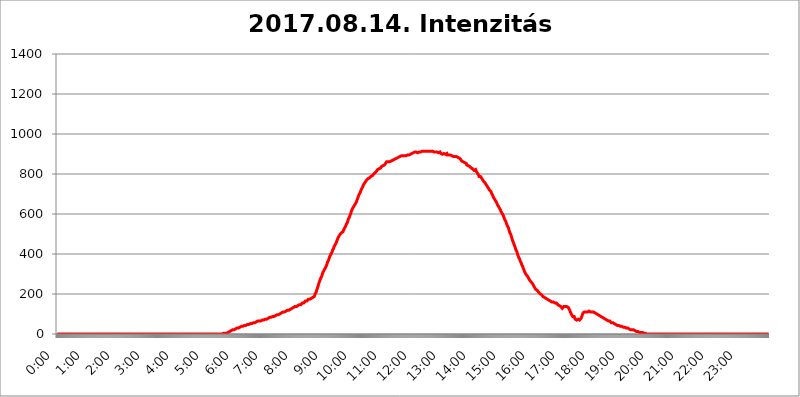
| Category | 2017.08.14. Intenzitás [W/m^2] |
|---|---|
| 0.0 | 0 |
| 0.0006944444444444445 | 0 |
| 0.001388888888888889 | 0 |
| 0.0020833333333333333 | 0 |
| 0.002777777777777778 | 0 |
| 0.003472222222222222 | 0 |
| 0.004166666666666667 | 0 |
| 0.004861111111111111 | 0 |
| 0.005555555555555556 | 0 |
| 0.0062499999999999995 | 0 |
| 0.006944444444444444 | 0 |
| 0.007638888888888889 | 0 |
| 0.008333333333333333 | 0 |
| 0.009027777777777779 | 0 |
| 0.009722222222222222 | 0 |
| 0.010416666666666666 | 0 |
| 0.011111111111111112 | 0 |
| 0.011805555555555555 | 0 |
| 0.012499999999999999 | 0 |
| 0.013194444444444444 | 0 |
| 0.013888888888888888 | 0 |
| 0.014583333333333332 | 0 |
| 0.015277777777777777 | 0 |
| 0.015972222222222224 | 0 |
| 0.016666666666666666 | 0 |
| 0.017361111111111112 | 0 |
| 0.018055555555555557 | 0 |
| 0.01875 | 0 |
| 0.019444444444444445 | 0 |
| 0.02013888888888889 | 0 |
| 0.020833333333333332 | 0 |
| 0.02152777777777778 | 0 |
| 0.022222222222222223 | 0 |
| 0.02291666666666667 | 0 |
| 0.02361111111111111 | 0 |
| 0.024305555555555556 | 0 |
| 0.024999999999999998 | 0 |
| 0.025694444444444447 | 0 |
| 0.02638888888888889 | 0 |
| 0.027083333333333334 | 0 |
| 0.027777777777777776 | 0 |
| 0.02847222222222222 | 0 |
| 0.029166666666666664 | 0 |
| 0.029861111111111113 | 0 |
| 0.030555555555555555 | 0 |
| 0.03125 | 0 |
| 0.03194444444444445 | 0 |
| 0.03263888888888889 | 0 |
| 0.03333333333333333 | 0 |
| 0.034027777777777775 | 0 |
| 0.034722222222222224 | 0 |
| 0.035416666666666666 | 0 |
| 0.036111111111111115 | 0 |
| 0.03680555555555556 | 0 |
| 0.0375 | 0 |
| 0.03819444444444444 | 0 |
| 0.03888888888888889 | 0 |
| 0.03958333333333333 | 0 |
| 0.04027777777777778 | 0 |
| 0.04097222222222222 | 0 |
| 0.041666666666666664 | 0 |
| 0.042361111111111106 | 0 |
| 0.04305555555555556 | 0 |
| 0.043750000000000004 | 0 |
| 0.044444444444444446 | 0 |
| 0.04513888888888889 | 0 |
| 0.04583333333333334 | 0 |
| 0.04652777777777778 | 0 |
| 0.04722222222222222 | 0 |
| 0.04791666666666666 | 0 |
| 0.04861111111111111 | 0 |
| 0.049305555555555554 | 0 |
| 0.049999999999999996 | 0 |
| 0.05069444444444445 | 0 |
| 0.051388888888888894 | 0 |
| 0.052083333333333336 | 0 |
| 0.05277777777777778 | 0 |
| 0.05347222222222222 | 0 |
| 0.05416666666666667 | 0 |
| 0.05486111111111111 | 0 |
| 0.05555555555555555 | 0 |
| 0.05625 | 0 |
| 0.05694444444444444 | 0 |
| 0.057638888888888885 | 0 |
| 0.05833333333333333 | 0 |
| 0.05902777777777778 | 0 |
| 0.059722222222222225 | 0 |
| 0.06041666666666667 | 0 |
| 0.061111111111111116 | 0 |
| 0.06180555555555556 | 0 |
| 0.0625 | 0 |
| 0.06319444444444444 | 0 |
| 0.06388888888888888 | 0 |
| 0.06458333333333334 | 0 |
| 0.06527777777777778 | 0 |
| 0.06597222222222222 | 0 |
| 0.06666666666666667 | 0 |
| 0.06736111111111111 | 0 |
| 0.06805555555555555 | 0 |
| 0.06874999999999999 | 0 |
| 0.06944444444444443 | 0 |
| 0.07013888888888889 | 0 |
| 0.07083333333333333 | 0 |
| 0.07152777777777779 | 0 |
| 0.07222222222222223 | 0 |
| 0.07291666666666667 | 0 |
| 0.07361111111111111 | 0 |
| 0.07430555555555556 | 0 |
| 0.075 | 0 |
| 0.07569444444444444 | 0 |
| 0.0763888888888889 | 0 |
| 0.07708333333333334 | 0 |
| 0.07777777777777778 | 0 |
| 0.07847222222222222 | 0 |
| 0.07916666666666666 | 0 |
| 0.0798611111111111 | 0 |
| 0.08055555555555556 | 0 |
| 0.08125 | 0 |
| 0.08194444444444444 | 0 |
| 0.08263888888888889 | 0 |
| 0.08333333333333333 | 0 |
| 0.08402777777777777 | 0 |
| 0.08472222222222221 | 0 |
| 0.08541666666666665 | 0 |
| 0.08611111111111112 | 0 |
| 0.08680555555555557 | 0 |
| 0.08750000000000001 | 0 |
| 0.08819444444444445 | 0 |
| 0.08888888888888889 | 0 |
| 0.08958333333333333 | 0 |
| 0.09027777777777778 | 0 |
| 0.09097222222222222 | 0 |
| 0.09166666666666667 | 0 |
| 0.09236111111111112 | 0 |
| 0.09305555555555556 | 0 |
| 0.09375 | 0 |
| 0.09444444444444444 | 0 |
| 0.09513888888888888 | 0 |
| 0.09583333333333333 | 0 |
| 0.09652777777777777 | 0 |
| 0.09722222222222222 | 0 |
| 0.09791666666666667 | 0 |
| 0.09861111111111111 | 0 |
| 0.09930555555555555 | 0 |
| 0.09999999999999999 | 0 |
| 0.10069444444444443 | 0 |
| 0.1013888888888889 | 0 |
| 0.10208333333333335 | 0 |
| 0.10277777777777779 | 0 |
| 0.10347222222222223 | 0 |
| 0.10416666666666667 | 0 |
| 0.10486111111111111 | 0 |
| 0.10555555555555556 | 0 |
| 0.10625 | 0 |
| 0.10694444444444444 | 0 |
| 0.1076388888888889 | 0 |
| 0.10833333333333334 | 0 |
| 0.10902777777777778 | 0 |
| 0.10972222222222222 | 0 |
| 0.1111111111111111 | 0 |
| 0.11180555555555556 | 0 |
| 0.11180555555555556 | 0 |
| 0.1125 | 0 |
| 0.11319444444444444 | 0 |
| 0.11388888888888889 | 0 |
| 0.11458333333333333 | 0 |
| 0.11527777777777777 | 0 |
| 0.11597222222222221 | 0 |
| 0.11666666666666665 | 0 |
| 0.1173611111111111 | 0 |
| 0.11805555555555557 | 0 |
| 0.11944444444444445 | 0 |
| 0.12013888888888889 | 0 |
| 0.12083333333333333 | 0 |
| 0.12152777777777778 | 0 |
| 0.12222222222222223 | 0 |
| 0.12291666666666667 | 0 |
| 0.12291666666666667 | 0 |
| 0.12361111111111112 | 0 |
| 0.12430555555555556 | 0 |
| 0.125 | 0 |
| 0.12569444444444444 | 0 |
| 0.12638888888888888 | 0 |
| 0.12708333333333333 | 0 |
| 0.16875 | 0 |
| 0.12847222222222224 | 0 |
| 0.12916666666666668 | 0 |
| 0.12986111111111112 | 0 |
| 0.13055555555555556 | 0 |
| 0.13125 | 0 |
| 0.13194444444444445 | 0 |
| 0.1326388888888889 | 0 |
| 0.13333333333333333 | 0 |
| 0.13402777777777777 | 0 |
| 0.13402777777777777 | 0 |
| 0.13472222222222222 | 0 |
| 0.13541666666666666 | 0 |
| 0.1361111111111111 | 0 |
| 0.13749999999999998 | 0 |
| 0.13819444444444443 | 0 |
| 0.1388888888888889 | 0 |
| 0.13958333333333334 | 0 |
| 0.14027777777777778 | 0 |
| 0.14097222222222222 | 0 |
| 0.14166666666666666 | 0 |
| 0.1423611111111111 | 0 |
| 0.14305555555555557 | 0 |
| 0.14375000000000002 | 0 |
| 0.14444444444444446 | 0 |
| 0.1451388888888889 | 0 |
| 0.1451388888888889 | 0 |
| 0.14652777777777778 | 0 |
| 0.14722222222222223 | 0 |
| 0.14791666666666667 | 0 |
| 0.1486111111111111 | 0 |
| 0.14930555555555555 | 0 |
| 0.15 | 0 |
| 0.15069444444444444 | 0 |
| 0.15138888888888888 | 0 |
| 0.15208333333333332 | 0 |
| 0.15277777777777776 | 0 |
| 0.15347222222222223 | 0 |
| 0.15416666666666667 | 0 |
| 0.15486111111111112 | 0 |
| 0.15555555555555556 | 0 |
| 0.15625 | 0 |
| 0.15694444444444444 | 0 |
| 0.15763888888888888 | 0 |
| 0.15833333333333333 | 0 |
| 0.15902777777777777 | 0 |
| 0.15972222222222224 | 0 |
| 0.16041666666666668 | 0 |
| 0.16111111111111112 | 0 |
| 0.16180555555555556 | 0 |
| 0.1625 | 0 |
| 0.16319444444444445 | 0 |
| 0.1638888888888889 | 0 |
| 0.16458333333333333 | 0 |
| 0.16527777777777777 | 0 |
| 0.16597222222222222 | 0 |
| 0.16666666666666666 | 0 |
| 0.1673611111111111 | 0 |
| 0.16805555555555554 | 0 |
| 0.16874999999999998 | 0 |
| 0.16944444444444443 | 0 |
| 0.17013888888888887 | 0 |
| 0.1708333333333333 | 0 |
| 0.17152777777777775 | 0 |
| 0.17222222222222225 | 0 |
| 0.1729166666666667 | 0 |
| 0.17361111111111113 | 0 |
| 0.17430555555555557 | 0 |
| 0.17500000000000002 | 0 |
| 0.17569444444444446 | 0 |
| 0.1763888888888889 | 0 |
| 0.17708333333333334 | 0 |
| 0.17777777777777778 | 0 |
| 0.17847222222222223 | 0 |
| 0.17916666666666667 | 0 |
| 0.1798611111111111 | 0 |
| 0.18055555555555555 | 0 |
| 0.18125 | 0 |
| 0.18194444444444444 | 0 |
| 0.1826388888888889 | 0 |
| 0.18333333333333335 | 0 |
| 0.1840277777777778 | 0 |
| 0.18472222222222223 | 0 |
| 0.18541666666666667 | 0 |
| 0.18611111111111112 | 0 |
| 0.18680555555555556 | 0 |
| 0.1875 | 0 |
| 0.18819444444444444 | 0 |
| 0.18888888888888888 | 0 |
| 0.18958333333333333 | 0 |
| 0.19027777777777777 | 0 |
| 0.1909722222222222 | 0 |
| 0.19166666666666665 | 0 |
| 0.19236111111111112 | 0 |
| 0.19305555555555554 | 0 |
| 0.19375 | 0 |
| 0.19444444444444445 | 0 |
| 0.1951388888888889 | 0 |
| 0.19583333333333333 | 0 |
| 0.19652777777777777 | 0 |
| 0.19722222222222222 | 0 |
| 0.19791666666666666 | 0 |
| 0.1986111111111111 | 0 |
| 0.19930555555555554 | 0 |
| 0.19999999999999998 | 0 |
| 0.20069444444444443 | 0 |
| 0.20138888888888887 | 0 |
| 0.2020833333333333 | 0 |
| 0.2027777777777778 | 0 |
| 0.2034722222222222 | 0 |
| 0.2041666666666667 | 0 |
| 0.20486111111111113 | 0 |
| 0.20555555555555557 | 0 |
| 0.20625000000000002 | 0 |
| 0.20694444444444446 | 0 |
| 0.2076388888888889 | 0 |
| 0.20833333333333334 | 0 |
| 0.20902777777777778 | 0 |
| 0.20972222222222223 | 0 |
| 0.21041666666666667 | 0 |
| 0.2111111111111111 | 0 |
| 0.21180555555555555 | 0 |
| 0.2125 | 0 |
| 0.21319444444444444 | 0 |
| 0.2138888888888889 | 0 |
| 0.21458333333333335 | 0 |
| 0.2152777777777778 | 0 |
| 0.21597222222222223 | 0 |
| 0.21666666666666667 | 0 |
| 0.21736111111111112 | 0 |
| 0.21805555555555556 | 0 |
| 0.21875 | 0 |
| 0.21944444444444444 | 0 |
| 0.22013888888888888 | 0 |
| 0.22083333333333333 | 0 |
| 0.22152777777777777 | 0 |
| 0.2222222222222222 | 0 |
| 0.22291666666666665 | 0 |
| 0.2236111111111111 | 0 |
| 0.22430555555555556 | 0 |
| 0.225 | 0 |
| 0.22569444444444445 | 0 |
| 0.2263888888888889 | 0 |
| 0.22708333333333333 | 0 |
| 0.22777777777777777 | 0 |
| 0.22847222222222222 | 0 |
| 0.22916666666666666 | 0 |
| 0.2298611111111111 | 0 |
| 0.23055555555555554 | 0 |
| 0.23124999999999998 | 0 |
| 0.23194444444444443 | 3.525 |
| 0.23263888888888887 | 3.525 |
| 0.2333333333333333 | 3.525 |
| 0.2340277777777778 | 3.525 |
| 0.2347222222222222 | 3.525 |
| 0.2354166666666667 | 3.525 |
| 0.23611111111111113 | 3.525 |
| 0.23680555555555557 | 3.525 |
| 0.23750000000000002 | 3.525 |
| 0.23819444444444446 | 3.525 |
| 0.2388888888888889 | 7.887 |
| 0.23958333333333334 | 7.887 |
| 0.24027777777777778 | 7.887 |
| 0.24097222222222223 | 12.257 |
| 0.24166666666666667 | 12.257 |
| 0.2423611111111111 | 12.257 |
| 0.24305555555555555 | 12.257 |
| 0.24375 | 16.636 |
| 0.24444444444444446 | 16.636 |
| 0.24513888888888888 | 16.636 |
| 0.24583333333333335 | 21.024 |
| 0.2465277777777778 | 21.024 |
| 0.24722222222222223 | 21.024 |
| 0.24791666666666667 | 21.024 |
| 0.24861111111111112 | 21.024 |
| 0.24930555555555556 | 25.419 |
| 0.25 | 25.419 |
| 0.25069444444444444 | 25.419 |
| 0.2513888888888889 | 25.419 |
| 0.2520833333333333 | 29.823 |
| 0.25277777777777777 | 29.823 |
| 0.2534722222222222 | 29.823 |
| 0.25416666666666665 | 29.823 |
| 0.2548611111111111 | 29.823 |
| 0.2555555555555556 | 34.234 |
| 0.25625000000000003 | 34.234 |
| 0.2569444444444445 | 34.234 |
| 0.2576388888888889 | 34.234 |
| 0.25833333333333336 | 38.653 |
| 0.2590277777777778 | 38.653 |
| 0.25972222222222224 | 38.653 |
| 0.2604166666666667 | 38.653 |
| 0.2611111111111111 | 38.653 |
| 0.26180555555555557 | 38.653 |
| 0.2625 | 43.079 |
| 0.26319444444444445 | 43.079 |
| 0.2638888888888889 | 43.079 |
| 0.26458333333333334 | 43.079 |
| 0.2652777777777778 | 43.079 |
| 0.2659722222222222 | 47.511 |
| 0.26666666666666666 | 47.511 |
| 0.2673611111111111 | 47.511 |
| 0.26805555555555555 | 47.511 |
| 0.26875 | 47.511 |
| 0.26944444444444443 | 47.511 |
| 0.2701388888888889 | 51.951 |
| 0.2708333333333333 | 51.951 |
| 0.27152777777777776 | 51.951 |
| 0.2722222222222222 | 51.951 |
| 0.27291666666666664 | 51.951 |
| 0.2736111111111111 | 56.398 |
| 0.2743055555555555 | 56.398 |
| 0.27499999999999997 | 56.398 |
| 0.27569444444444446 | 56.398 |
| 0.27638888888888885 | 56.398 |
| 0.27708333333333335 | 56.398 |
| 0.2777777777777778 | 60.85 |
| 0.27847222222222223 | 60.85 |
| 0.2791666666666667 | 60.85 |
| 0.2798611111111111 | 60.85 |
| 0.28055555555555556 | 60.85 |
| 0.28125 | 65.31 |
| 0.28194444444444444 | 65.31 |
| 0.2826388888888889 | 65.31 |
| 0.2833333333333333 | 65.31 |
| 0.28402777777777777 | 65.31 |
| 0.2847222222222222 | 65.31 |
| 0.28541666666666665 | 65.31 |
| 0.28611111111111115 | 69.775 |
| 0.28680555555555554 | 69.775 |
| 0.28750000000000003 | 69.775 |
| 0.2881944444444445 | 69.775 |
| 0.2888888888888889 | 69.775 |
| 0.28958333333333336 | 69.775 |
| 0.2902777777777778 | 74.246 |
| 0.29097222222222224 | 74.246 |
| 0.2916666666666667 | 74.246 |
| 0.2923611111111111 | 74.246 |
| 0.29305555555555557 | 74.246 |
| 0.29375 | 74.246 |
| 0.29444444444444445 | 74.246 |
| 0.2951388888888889 | 78.722 |
| 0.29583333333333334 | 78.722 |
| 0.2965277777777778 | 78.722 |
| 0.2972222222222222 | 78.722 |
| 0.29791666666666666 | 83.205 |
| 0.2986111111111111 | 83.205 |
| 0.29930555555555555 | 83.205 |
| 0.3 | 83.205 |
| 0.30069444444444443 | 83.205 |
| 0.3013888888888889 | 83.205 |
| 0.3020833333333333 | 87.692 |
| 0.30277777777777776 | 87.692 |
| 0.3034722222222222 | 87.692 |
| 0.30416666666666664 | 87.692 |
| 0.3048611111111111 | 92.184 |
| 0.3055555555555555 | 92.184 |
| 0.30624999999999997 | 92.184 |
| 0.3069444444444444 | 92.184 |
| 0.3076388888888889 | 92.184 |
| 0.30833333333333335 | 96.682 |
| 0.3090277777777778 | 96.682 |
| 0.30972222222222223 | 96.682 |
| 0.3104166666666667 | 96.682 |
| 0.3111111111111111 | 101.184 |
| 0.31180555555555556 | 101.184 |
| 0.3125 | 101.184 |
| 0.31319444444444444 | 101.184 |
| 0.3138888888888889 | 101.184 |
| 0.3145833333333333 | 105.69 |
| 0.31527777777777777 | 105.69 |
| 0.3159722222222222 | 105.69 |
| 0.31666666666666665 | 110.201 |
| 0.31736111111111115 | 110.201 |
| 0.31805555555555554 | 110.201 |
| 0.31875000000000003 | 110.201 |
| 0.3194444444444445 | 110.201 |
| 0.3201388888888889 | 114.716 |
| 0.32083333333333336 | 114.716 |
| 0.3215277777777778 | 114.716 |
| 0.32222222222222224 | 119.235 |
| 0.3229166666666667 | 119.235 |
| 0.3236111111111111 | 119.235 |
| 0.32430555555555557 | 119.235 |
| 0.325 | 119.235 |
| 0.32569444444444445 | 123.758 |
| 0.3263888888888889 | 123.758 |
| 0.32708333333333334 | 123.758 |
| 0.3277777777777778 | 128.284 |
| 0.3284722222222222 | 128.284 |
| 0.32916666666666666 | 128.284 |
| 0.3298611111111111 | 128.284 |
| 0.33055555555555555 | 132.814 |
| 0.33125 | 132.814 |
| 0.33194444444444443 | 132.814 |
| 0.3326388888888889 | 132.814 |
| 0.3333333333333333 | 137.347 |
| 0.3340277777777778 | 137.347 |
| 0.3347222222222222 | 137.347 |
| 0.3354166666666667 | 137.347 |
| 0.3361111111111111 | 137.347 |
| 0.3368055555555556 | 141.884 |
| 0.33749999999999997 | 141.884 |
| 0.33819444444444446 | 141.884 |
| 0.33888888888888885 | 146.423 |
| 0.33958333333333335 | 146.423 |
| 0.34027777777777773 | 146.423 |
| 0.34097222222222223 | 146.423 |
| 0.3416666666666666 | 146.423 |
| 0.3423611111111111 | 150.964 |
| 0.3430555555555555 | 150.964 |
| 0.34375 | 155.509 |
| 0.3444444444444445 | 155.509 |
| 0.3451388888888889 | 155.509 |
| 0.3458333333333334 | 155.509 |
| 0.34652777777777777 | 160.056 |
| 0.34722222222222227 | 160.056 |
| 0.34791666666666665 | 164.605 |
| 0.34861111111111115 | 164.605 |
| 0.34930555555555554 | 164.605 |
| 0.35000000000000003 | 164.605 |
| 0.3506944444444444 | 169.156 |
| 0.3513888888888889 | 169.156 |
| 0.3520833333333333 | 173.709 |
| 0.3527777777777778 | 173.709 |
| 0.3534722222222222 | 173.709 |
| 0.3541666666666667 | 173.709 |
| 0.3548611111111111 | 173.709 |
| 0.35555555555555557 | 178.264 |
| 0.35625 | 178.264 |
| 0.35694444444444445 | 178.264 |
| 0.3576388888888889 | 182.82 |
| 0.35833333333333334 | 182.82 |
| 0.3590277777777778 | 182.82 |
| 0.3597222222222222 | 182.82 |
| 0.36041666666666666 | 187.378 |
| 0.3611111111111111 | 191.937 |
| 0.36180555555555555 | 201.058 |
| 0.3625 | 205.62 |
| 0.36319444444444443 | 210.182 |
| 0.3638888888888889 | 219.309 |
| 0.3645833333333333 | 223.873 |
| 0.3652777777777778 | 233 |
| 0.3659722222222222 | 242.127 |
| 0.3666666666666667 | 251.251 |
| 0.3673611111111111 | 255.813 |
| 0.3680555555555556 | 264.932 |
| 0.36874999999999997 | 269.49 |
| 0.36944444444444446 | 278.603 |
| 0.37013888888888885 | 283.156 |
| 0.37083333333333335 | 287.709 |
| 0.37152777777777773 | 296.808 |
| 0.37222222222222223 | 301.354 |
| 0.3729166666666666 | 310.44 |
| 0.3736111111111111 | 314.98 |
| 0.3743055555555555 | 319.517 |
| 0.375 | 324.052 |
| 0.3756944444444445 | 328.584 |
| 0.3763888888888889 | 333.113 |
| 0.3770833333333334 | 337.639 |
| 0.37777777777777777 | 342.162 |
| 0.37847222222222227 | 351.198 |
| 0.37916666666666665 | 360.221 |
| 0.37986111111111115 | 364.728 |
| 0.38055555555555554 | 369.23 |
| 0.38125000000000003 | 378.224 |
| 0.3819444444444444 | 382.715 |
| 0.3826388888888889 | 391.685 |
| 0.3833333333333333 | 396.164 |
| 0.3840277777777778 | 400.638 |
| 0.3847222222222222 | 405.108 |
| 0.3854166666666667 | 409.574 |
| 0.3861111111111111 | 418.492 |
| 0.38680555555555557 | 418.492 |
| 0.3875 | 427.39 |
| 0.38819444444444445 | 436.27 |
| 0.3888888888888889 | 440.702 |
| 0.38958333333333334 | 445.129 |
| 0.3902777777777778 | 449.551 |
| 0.3909722222222222 | 453.968 |
| 0.39166666666666666 | 458.38 |
| 0.3923611111111111 | 467.187 |
| 0.39305555555555555 | 471.582 |
| 0.39375 | 480.356 |
| 0.39444444444444443 | 484.735 |
| 0.3951388888888889 | 489.108 |
| 0.3958333333333333 | 493.475 |
| 0.3965277777777778 | 497.836 |
| 0.3972222222222222 | 497.836 |
| 0.3979166666666667 | 502.192 |
| 0.3986111111111111 | 506.542 |
| 0.3993055555555556 | 506.542 |
| 0.39999999999999997 | 506.542 |
| 0.40069444444444446 | 510.885 |
| 0.40138888888888885 | 515.223 |
| 0.40208333333333335 | 523.88 |
| 0.40277777777777773 | 523.88 |
| 0.40347222222222223 | 528.2 |
| 0.4041666666666666 | 536.82 |
| 0.4048611111111111 | 541.121 |
| 0.4055555555555555 | 549.704 |
| 0.40625 | 553.986 |
| 0.4069444444444445 | 558.261 |
| 0.4076388888888889 | 566.793 |
| 0.4083333333333334 | 575.299 |
| 0.40902777777777777 | 579.542 |
| 0.40972222222222227 | 583.779 |
| 0.41041666666666665 | 592.233 |
| 0.41111111111111115 | 596.45 |
| 0.41180555555555554 | 604.864 |
| 0.41250000000000003 | 613.252 |
| 0.4131944444444444 | 617.436 |
| 0.4138888888888889 | 625.784 |
| 0.4145833333333333 | 629.948 |
| 0.4152777777777778 | 634.105 |
| 0.4159722222222222 | 638.256 |
| 0.4166666666666667 | 642.4 |
| 0.4173611111111111 | 646.537 |
| 0.41805555555555557 | 650.667 |
| 0.41875 | 654.791 |
| 0.41944444444444445 | 658.909 |
| 0.4201388888888889 | 667.123 |
| 0.42083333333333334 | 671.22 |
| 0.4215277777777778 | 679.395 |
| 0.4222222222222222 | 687.544 |
| 0.42291666666666666 | 691.608 |
| 0.4236111111111111 | 699.717 |
| 0.42430555555555555 | 703.762 |
| 0.425 | 707.8 |
| 0.42569444444444443 | 715.858 |
| 0.4263888888888889 | 719.877 |
| 0.4270833333333333 | 727.896 |
| 0.4277777777777778 | 731.896 |
| 0.4284722222222222 | 735.89 |
| 0.4291666666666667 | 743.859 |
| 0.4298611111111111 | 747.834 |
| 0.4305555555555556 | 751.803 |
| 0.43124999999999997 | 755.766 |
| 0.43194444444444446 | 759.723 |
| 0.43263888888888885 | 763.674 |
| 0.43333333333333335 | 767.62 |
| 0.43402777777777773 | 767.62 |
| 0.43472222222222223 | 771.559 |
| 0.4354166666666666 | 775.492 |
| 0.4361111111111111 | 779.42 |
| 0.4368055555555555 | 775.492 |
| 0.4375 | 779.42 |
| 0.4381944444444445 | 783.342 |
| 0.4388888888888889 | 783.342 |
| 0.4395833333333334 | 787.258 |
| 0.44027777777777777 | 787.258 |
| 0.44097222222222227 | 791.169 |
| 0.44166666666666665 | 791.169 |
| 0.44236111111111115 | 795.074 |
| 0.44305555555555554 | 795.074 |
| 0.44375000000000003 | 798.974 |
| 0.4444444444444444 | 802.868 |
| 0.4451388888888889 | 802.868 |
| 0.4458333333333333 | 806.757 |
| 0.4465277777777778 | 810.641 |
| 0.4472222222222222 | 810.641 |
| 0.4479166666666667 | 814.519 |
| 0.4486111111111111 | 818.392 |
| 0.44930555555555557 | 822.26 |
| 0.45 | 822.26 |
| 0.45069444444444445 | 826.123 |
| 0.4513888888888889 | 826.123 |
| 0.45208333333333334 | 826.123 |
| 0.4527777777777778 | 829.981 |
| 0.4534722222222222 | 829.981 |
| 0.45416666666666666 | 833.834 |
| 0.4548611111111111 | 837.682 |
| 0.45555555555555555 | 841.526 |
| 0.45625 | 841.526 |
| 0.45694444444444443 | 841.526 |
| 0.4576388888888889 | 845.365 |
| 0.4583333333333333 | 845.365 |
| 0.4590277777777778 | 845.365 |
| 0.4597222222222222 | 849.199 |
| 0.4604166666666667 | 853.029 |
| 0.4611111111111111 | 856.855 |
| 0.4618055555555556 | 860.676 |
| 0.46249999999999997 | 860.676 |
| 0.46319444444444446 | 860.676 |
| 0.46388888888888885 | 860.676 |
| 0.46458333333333335 | 860.676 |
| 0.46527777777777773 | 860.676 |
| 0.46597222222222223 | 860.676 |
| 0.4666666666666666 | 860.676 |
| 0.4673611111111111 | 864.493 |
| 0.4680555555555555 | 864.493 |
| 0.46875 | 868.305 |
| 0.4694444444444445 | 868.305 |
| 0.4701388888888889 | 868.305 |
| 0.4708333333333334 | 868.305 |
| 0.47152777777777777 | 872.114 |
| 0.47222222222222227 | 872.114 |
| 0.47291666666666665 | 875.918 |
| 0.47361111111111115 | 875.918 |
| 0.47430555555555554 | 875.918 |
| 0.47500000000000003 | 875.918 |
| 0.4756944444444444 | 879.719 |
| 0.4763888888888889 | 879.719 |
| 0.4770833333333333 | 879.719 |
| 0.4777777777777778 | 879.719 |
| 0.4784722222222222 | 883.516 |
| 0.4791666666666667 | 887.309 |
| 0.4798611111111111 | 887.309 |
| 0.48055555555555557 | 887.309 |
| 0.48125 | 891.099 |
| 0.48194444444444445 | 891.099 |
| 0.4826388888888889 | 891.099 |
| 0.48333333333333334 | 894.885 |
| 0.4840277777777778 | 894.885 |
| 0.4847222222222222 | 891.099 |
| 0.48541666666666666 | 891.099 |
| 0.4861111111111111 | 891.099 |
| 0.48680555555555555 | 891.099 |
| 0.4875 | 887.309 |
| 0.48819444444444443 | 891.099 |
| 0.4888888888888889 | 891.099 |
| 0.4895833333333333 | 891.099 |
| 0.4902777777777778 | 894.885 |
| 0.4909722222222222 | 894.885 |
| 0.4916666666666667 | 894.885 |
| 0.4923611111111111 | 894.885 |
| 0.4930555555555556 | 894.885 |
| 0.49374999999999997 | 898.668 |
| 0.49444444444444446 | 898.668 |
| 0.49513888888888885 | 898.668 |
| 0.49583333333333335 | 898.668 |
| 0.49652777777777773 | 898.668 |
| 0.49722222222222223 | 902.447 |
| 0.4979166666666666 | 902.447 |
| 0.4986111111111111 | 902.447 |
| 0.4993055555555555 | 906.223 |
| 0.5 | 906.223 |
| 0.5006944444444444 | 906.223 |
| 0.5013888888888889 | 909.996 |
| 0.5020833333333333 | 909.996 |
| 0.5027777777777778 | 909.996 |
| 0.5034722222222222 | 909.996 |
| 0.5041666666666667 | 909.996 |
| 0.5048611111111111 | 906.223 |
| 0.5055555555555555 | 906.223 |
| 0.50625 | 909.996 |
| 0.5069444444444444 | 909.996 |
| 0.5076388888888889 | 909.996 |
| 0.5083333333333333 | 909.996 |
| 0.5090277777777777 | 909.996 |
| 0.5097222222222222 | 909.996 |
| 0.5104166666666666 | 913.766 |
| 0.5111111111111112 | 913.766 |
| 0.5118055555555555 | 913.766 |
| 0.5125000000000001 | 913.766 |
| 0.5131944444444444 | 913.766 |
| 0.513888888888889 | 913.766 |
| 0.5145833333333333 | 913.766 |
| 0.5152777777777778 | 913.766 |
| 0.5159722222222222 | 913.766 |
| 0.5166666666666667 | 913.766 |
| 0.517361111111111 | 913.766 |
| 0.5180555555555556 | 913.766 |
| 0.5187499999999999 | 913.766 |
| 0.5194444444444445 | 917.534 |
| 0.5201388888888888 | 913.766 |
| 0.5208333333333334 | 913.766 |
| 0.5215277777777778 | 913.766 |
| 0.5222222222222223 | 913.766 |
| 0.5229166666666667 | 913.766 |
| 0.5236111111111111 | 913.766 |
| 0.5243055555555556 | 913.766 |
| 0.525 | 913.766 |
| 0.5256944444444445 | 913.766 |
| 0.5263888888888889 | 913.766 |
| 0.5270833333333333 | 913.766 |
| 0.5277777777777778 | 913.766 |
| 0.5284722222222222 | 909.996 |
| 0.5291666666666667 | 913.766 |
| 0.5298611111111111 | 913.766 |
| 0.5305555555555556 | 909.996 |
| 0.53125 | 909.996 |
| 0.5319444444444444 | 909.996 |
| 0.5326388888888889 | 909.996 |
| 0.5333333333333333 | 909.996 |
| 0.5340277777777778 | 906.223 |
| 0.5347222222222222 | 906.223 |
| 0.5354166666666667 | 906.223 |
| 0.5361111111111111 | 906.223 |
| 0.5368055555555555 | 909.996 |
| 0.5375 | 906.223 |
| 0.5381944444444444 | 902.447 |
| 0.5388888888888889 | 902.447 |
| 0.5395833333333333 | 898.668 |
| 0.5402777777777777 | 898.668 |
| 0.5409722222222222 | 898.668 |
| 0.5416666666666666 | 902.447 |
| 0.5423611111111112 | 902.447 |
| 0.5430555555555555 | 902.447 |
| 0.5437500000000001 | 898.668 |
| 0.5444444444444444 | 898.668 |
| 0.545138888888889 | 902.447 |
| 0.5458333333333333 | 902.447 |
| 0.5465277777777778 | 902.447 |
| 0.5472222222222222 | 894.885 |
| 0.5479166666666667 | 894.885 |
| 0.548611111111111 | 894.885 |
| 0.5493055555555556 | 894.885 |
| 0.5499999999999999 | 894.885 |
| 0.5506944444444445 | 894.885 |
| 0.5513888888888888 | 894.885 |
| 0.5520833333333334 | 894.885 |
| 0.5527777777777778 | 891.099 |
| 0.5534722222222223 | 891.099 |
| 0.5541666666666667 | 887.309 |
| 0.5548611111111111 | 887.309 |
| 0.5555555555555556 | 887.309 |
| 0.55625 | 887.309 |
| 0.5569444444444445 | 887.309 |
| 0.5576388888888889 | 887.309 |
| 0.5583333333333333 | 887.309 |
| 0.5590277777777778 | 887.309 |
| 0.5597222222222222 | 887.309 |
| 0.5604166666666667 | 887.309 |
| 0.5611111111111111 | 883.516 |
| 0.5618055555555556 | 883.516 |
| 0.5625 | 883.516 |
| 0.5631944444444444 | 879.719 |
| 0.5638888888888889 | 879.719 |
| 0.5645833333333333 | 879.719 |
| 0.5652777777777778 | 875.918 |
| 0.5659722222222222 | 872.114 |
| 0.5666666666666667 | 868.305 |
| 0.5673611111111111 | 864.493 |
| 0.5680555555555555 | 864.493 |
| 0.56875 | 860.676 |
| 0.5694444444444444 | 860.676 |
| 0.5701388888888889 | 860.676 |
| 0.5708333333333333 | 856.855 |
| 0.5715277777777777 | 856.855 |
| 0.5722222222222222 | 853.029 |
| 0.5729166666666666 | 853.029 |
| 0.5736111111111112 | 853.029 |
| 0.5743055555555555 | 845.365 |
| 0.5750000000000001 | 845.365 |
| 0.5756944444444444 | 841.526 |
| 0.576388888888889 | 841.526 |
| 0.5770833333333333 | 841.526 |
| 0.5777777777777778 | 837.682 |
| 0.5784722222222222 | 837.682 |
| 0.5791666666666667 | 837.682 |
| 0.579861111111111 | 833.834 |
| 0.5805555555555556 | 829.981 |
| 0.5812499999999999 | 829.981 |
| 0.5819444444444445 | 826.123 |
| 0.5826388888888888 | 826.123 |
| 0.5833333333333334 | 822.26 |
| 0.5840277777777778 | 822.26 |
| 0.5847222222222223 | 818.392 |
| 0.5854166666666667 | 814.519 |
| 0.5861111111111111 | 818.392 |
| 0.5868055555555556 | 822.26 |
| 0.5875 | 814.519 |
| 0.5881944444444445 | 814.519 |
| 0.5888888888888889 | 818.392 |
| 0.5895833333333333 | 802.868 |
| 0.5902777777777778 | 806.757 |
| 0.5909722222222222 | 795.074 |
| 0.5916666666666667 | 787.258 |
| 0.5923611111111111 | 787.258 |
| 0.5930555555555556 | 787.258 |
| 0.59375 | 787.258 |
| 0.5944444444444444 | 783.342 |
| 0.5951388888888889 | 779.42 |
| 0.5958333333333333 | 775.492 |
| 0.5965277777777778 | 771.559 |
| 0.5972222222222222 | 767.62 |
| 0.5979166666666667 | 763.674 |
| 0.5986111111111111 | 759.723 |
| 0.5993055555555555 | 759.723 |
| 0.6 | 755.766 |
| 0.6006944444444444 | 751.803 |
| 0.6013888888888889 | 747.834 |
| 0.6020833333333333 | 743.859 |
| 0.6027777777777777 | 739.877 |
| 0.6034722222222222 | 735.89 |
| 0.6041666666666666 | 731.896 |
| 0.6048611111111112 | 727.896 |
| 0.6055555555555555 | 727.896 |
| 0.6062500000000001 | 719.877 |
| 0.6069444444444444 | 719.877 |
| 0.607638888888889 | 715.858 |
| 0.6083333333333333 | 711.832 |
| 0.6090277777777778 | 703.762 |
| 0.6097222222222222 | 699.717 |
| 0.6104166666666667 | 695.666 |
| 0.611111111111111 | 691.608 |
| 0.6118055555555556 | 683.473 |
| 0.6124999999999999 | 679.395 |
| 0.6131944444444445 | 675.311 |
| 0.6138888888888888 | 671.22 |
| 0.6145833333333334 | 667.123 |
| 0.6152777777777778 | 663.019 |
| 0.6159722222222223 | 658.909 |
| 0.6166666666666667 | 654.791 |
| 0.6173611111111111 | 646.537 |
| 0.6180555555555556 | 642.4 |
| 0.61875 | 638.256 |
| 0.6194444444444445 | 634.105 |
| 0.6201388888888889 | 629.948 |
| 0.6208333333333333 | 625.784 |
| 0.6215277777777778 | 621.613 |
| 0.6222222222222222 | 613.252 |
| 0.6229166666666667 | 613.252 |
| 0.6236111111111111 | 609.062 |
| 0.6243055555555556 | 600.661 |
| 0.625 | 596.45 |
| 0.6256944444444444 | 592.233 |
| 0.6263888888888889 | 583.779 |
| 0.6270833333333333 | 579.542 |
| 0.6277777777777778 | 571.049 |
| 0.6284722222222222 | 566.793 |
| 0.6291666666666667 | 562.53 |
| 0.6298611111111111 | 553.986 |
| 0.6305555555555555 | 549.704 |
| 0.63125 | 541.121 |
| 0.6319444444444444 | 536.82 |
| 0.6326388888888889 | 532.513 |
| 0.6333333333333333 | 523.88 |
| 0.6340277777777777 | 515.223 |
| 0.6347222222222222 | 506.542 |
| 0.6354166666666666 | 502.192 |
| 0.6361111111111112 | 497.836 |
| 0.6368055555555555 | 489.108 |
| 0.6375000000000001 | 480.356 |
| 0.6381944444444444 | 471.582 |
| 0.638888888888889 | 467.187 |
| 0.6395833333333333 | 458.38 |
| 0.6402777777777778 | 453.968 |
| 0.6409722222222222 | 445.129 |
| 0.6416666666666667 | 440.702 |
| 0.642361111111111 | 431.833 |
| 0.6430555555555556 | 422.943 |
| 0.6437499999999999 | 418.492 |
| 0.6444444444444445 | 414.035 |
| 0.6451388888888888 | 405.108 |
| 0.6458333333333334 | 396.164 |
| 0.6465277777777778 | 391.685 |
| 0.6472222222222223 | 382.715 |
| 0.6479166666666667 | 378.224 |
| 0.6486111111111111 | 373.729 |
| 0.6493055555555556 | 364.728 |
| 0.65 | 360.221 |
| 0.6506944444444445 | 355.712 |
| 0.6513888888888889 | 346.682 |
| 0.6520833333333333 | 342.162 |
| 0.6527777777777778 | 337.639 |
| 0.6534722222222222 | 333.113 |
| 0.6541666666666667 | 324.052 |
| 0.6548611111111111 | 319.517 |
| 0.6555555555555556 | 310.44 |
| 0.65625 | 305.898 |
| 0.6569444444444444 | 305.898 |
| 0.6576388888888889 | 296.808 |
| 0.6583333333333333 | 296.808 |
| 0.6590277777777778 | 292.259 |
| 0.6597222222222222 | 287.709 |
| 0.6604166666666667 | 283.156 |
| 0.6611111111111111 | 278.603 |
| 0.6618055555555555 | 274.047 |
| 0.6625 | 269.49 |
| 0.6631944444444444 | 264.932 |
| 0.6638888888888889 | 264.932 |
| 0.6645833333333333 | 260.373 |
| 0.6652777777777777 | 255.813 |
| 0.6659722222222222 | 255.813 |
| 0.6666666666666666 | 251.251 |
| 0.6673611111111111 | 246.689 |
| 0.6680555555555556 | 242.127 |
| 0.6687500000000001 | 237.564 |
| 0.6694444444444444 | 233 |
| 0.6701388888888888 | 228.436 |
| 0.6708333333333334 | 223.873 |
| 0.6715277777777778 | 223.873 |
| 0.6722222222222222 | 219.309 |
| 0.6729166666666666 | 219.309 |
| 0.6736111111111112 | 214.746 |
| 0.6743055555555556 | 214.746 |
| 0.6749999999999999 | 210.182 |
| 0.6756944444444444 | 205.62 |
| 0.6763888888888889 | 205.62 |
| 0.6770833333333334 | 201.058 |
| 0.6777777777777777 | 201.058 |
| 0.6784722222222223 | 201.058 |
| 0.6791666666666667 | 196.497 |
| 0.6798611111111111 | 191.937 |
| 0.6805555555555555 | 191.937 |
| 0.68125 | 187.378 |
| 0.6819444444444445 | 182.82 |
| 0.6826388888888889 | 182.82 |
| 0.6833333333333332 | 182.82 |
| 0.6840277777777778 | 182.82 |
| 0.6847222222222222 | 182.82 |
| 0.6854166666666667 | 178.264 |
| 0.686111111111111 | 178.264 |
| 0.6868055555555556 | 178.264 |
| 0.6875 | 173.709 |
| 0.6881944444444444 | 173.709 |
| 0.688888888888889 | 173.709 |
| 0.6895833333333333 | 169.156 |
| 0.6902777777777778 | 169.156 |
| 0.6909722222222222 | 164.605 |
| 0.6916666666666668 | 164.605 |
| 0.6923611111111111 | 164.605 |
| 0.6930555555555555 | 164.605 |
| 0.69375 | 160.056 |
| 0.6944444444444445 | 160.056 |
| 0.6951388888888889 | 160.056 |
| 0.6958333333333333 | 160.056 |
| 0.6965277777777777 | 155.509 |
| 0.6972222222222223 | 155.509 |
| 0.6979166666666666 | 155.509 |
| 0.6986111111111111 | 155.509 |
| 0.6993055555555556 | 155.509 |
| 0.7000000000000001 | 155.509 |
| 0.7006944444444444 | 155.509 |
| 0.7013888888888888 | 150.964 |
| 0.7020833333333334 | 146.423 |
| 0.7027777777777778 | 146.423 |
| 0.7034722222222222 | 141.884 |
| 0.7041666666666666 | 141.884 |
| 0.7048611111111112 | 146.423 |
| 0.7055555555555556 | 141.884 |
| 0.7062499999999999 | 137.347 |
| 0.7069444444444444 | 137.347 |
| 0.7076388888888889 | 132.814 |
| 0.7083333333333334 | 128.284 |
| 0.7090277777777777 | 132.814 |
| 0.7097222222222223 | 132.814 |
| 0.7104166666666667 | 137.347 |
| 0.7111111111111111 | 137.347 |
| 0.7118055555555555 | 137.347 |
| 0.7125 | 137.347 |
| 0.7131944444444445 | 137.347 |
| 0.7138888888888889 | 137.347 |
| 0.7145833333333332 | 137.347 |
| 0.7152777777777778 | 132.814 |
| 0.7159722222222222 | 137.347 |
| 0.7166666666666667 | 132.814 |
| 0.717361111111111 | 128.284 |
| 0.7180555555555556 | 128.284 |
| 0.71875 | 119.235 |
| 0.7194444444444444 | 119.235 |
| 0.720138888888889 | 105.69 |
| 0.7208333333333333 | 105.69 |
| 0.7215277777777778 | 96.682 |
| 0.7222222222222222 | 92.184 |
| 0.7229166666666668 | 87.692 |
| 0.7236111111111111 | 87.692 |
| 0.7243055555555555 | 87.692 |
| 0.725 | 87.692 |
| 0.7256944444444445 | 83.205 |
| 0.7263888888888889 | 74.246 |
| 0.7270833333333333 | 69.775 |
| 0.7277777777777777 | 69.775 |
| 0.7284722222222223 | 69.775 |
| 0.7291666666666666 | 69.775 |
| 0.7298611111111111 | 69.775 |
| 0.7305555555555556 | 74.246 |
| 0.7312500000000001 | 74.246 |
| 0.7319444444444444 | 74.246 |
| 0.7326388888888888 | 69.775 |
| 0.7333333333333334 | 74.246 |
| 0.7340277777777778 | 74.246 |
| 0.7347222222222222 | 78.722 |
| 0.7354166666666666 | 83.205 |
| 0.7361111111111112 | 92.184 |
| 0.7368055555555556 | 96.682 |
| 0.7374999999999999 | 105.69 |
| 0.7381944444444444 | 105.69 |
| 0.7388888888888889 | 101.184 |
| 0.7395833333333334 | 110.201 |
| 0.7402777777777777 | 110.201 |
| 0.7409722222222223 | 110.201 |
| 0.7416666666666667 | 110.201 |
| 0.7423611111111111 | 110.201 |
| 0.7430555555555555 | 114.716 |
| 0.74375 | 110.201 |
| 0.7444444444444445 | 114.716 |
| 0.7451388888888889 | 114.716 |
| 0.7458333333333332 | 114.716 |
| 0.7465277777777778 | 114.716 |
| 0.7472222222222222 | 114.716 |
| 0.7479166666666667 | 110.201 |
| 0.748611111111111 | 110.201 |
| 0.7493055555555556 | 110.201 |
| 0.75 | 110.201 |
| 0.7506944444444444 | 110.201 |
| 0.751388888888889 | 110.201 |
| 0.7520833333333333 | 110.201 |
| 0.7527777777777778 | 110.201 |
| 0.7534722222222222 | 105.69 |
| 0.7541666666666668 | 105.69 |
| 0.7548611111111111 | 105.69 |
| 0.7555555555555555 | 101.184 |
| 0.75625 | 101.184 |
| 0.7569444444444445 | 96.682 |
| 0.7576388888888889 | 96.682 |
| 0.7583333333333333 | 96.682 |
| 0.7590277777777777 | 92.184 |
| 0.7597222222222223 | 92.184 |
| 0.7604166666666666 | 92.184 |
| 0.7611111111111111 | 92.184 |
| 0.7618055555555556 | 87.692 |
| 0.7625000000000001 | 87.692 |
| 0.7631944444444444 | 83.205 |
| 0.7638888888888888 | 83.205 |
| 0.7645833333333334 | 83.205 |
| 0.7652777777777778 | 83.205 |
| 0.7659722222222222 | 78.722 |
| 0.7666666666666666 | 78.722 |
| 0.7673611111111112 | 78.722 |
| 0.7680555555555556 | 74.246 |
| 0.7687499999999999 | 74.246 |
| 0.7694444444444444 | 74.246 |
| 0.7701388888888889 | 74.246 |
| 0.7708333333333334 | 69.775 |
| 0.7715277777777777 | 69.775 |
| 0.7722222222222223 | 69.775 |
| 0.7729166666666667 | 65.31 |
| 0.7736111111111111 | 65.31 |
| 0.7743055555555555 | 65.31 |
| 0.775 | 65.31 |
| 0.7756944444444445 | 60.85 |
| 0.7763888888888889 | 60.85 |
| 0.7770833333333332 | 56.398 |
| 0.7777777777777778 | 56.398 |
| 0.7784722222222222 | 56.398 |
| 0.7791666666666667 | 56.398 |
| 0.779861111111111 | 51.951 |
| 0.7805555555555556 | 51.951 |
| 0.78125 | 51.951 |
| 0.7819444444444444 | 51.951 |
| 0.782638888888889 | 47.511 |
| 0.7833333333333333 | 47.511 |
| 0.7840277777777778 | 47.511 |
| 0.7847222222222222 | 47.511 |
| 0.7854166666666668 | 43.079 |
| 0.7861111111111111 | 43.079 |
| 0.7868055555555555 | 43.079 |
| 0.7875 | 43.079 |
| 0.7881944444444445 | 43.079 |
| 0.7888888888888889 | 38.653 |
| 0.7895833333333333 | 38.653 |
| 0.7902777777777777 | 38.653 |
| 0.7909722222222223 | 38.653 |
| 0.7916666666666666 | 38.653 |
| 0.7923611111111111 | 38.653 |
| 0.7930555555555556 | 38.653 |
| 0.7937500000000001 | 34.234 |
| 0.7944444444444444 | 34.234 |
| 0.7951388888888888 | 34.234 |
| 0.7958333333333334 | 34.234 |
| 0.7965277777777778 | 29.823 |
| 0.7972222222222222 | 29.823 |
| 0.7979166666666666 | 29.823 |
| 0.7986111111111112 | 29.823 |
| 0.7993055555555556 | 29.823 |
| 0.7999999999999999 | 29.823 |
| 0.8006944444444444 | 25.419 |
| 0.8013888888888889 | 25.419 |
| 0.8020833333333334 | 25.419 |
| 0.8027777777777777 | 25.419 |
| 0.8034722222222223 | 25.419 |
| 0.8041666666666667 | 21.024 |
| 0.8048611111111111 | 21.024 |
| 0.8055555555555555 | 21.024 |
| 0.80625 | 21.024 |
| 0.8069444444444445 | 21.024 |
| 0.8076388888888889 | 21.024 |
| 0.8083333333333332 | 21.024 |
| 0.8090277777777778 | 16.636 |
| 0.8097222222222222 | 16.636 |
| 0.8104166666666667 | 16.636 |
| 0.811111111111111 | 16.636 |
| 0.8118055555555556 | 16.636 |
| 0.8125 | 12.257 |
| 0.8131944444444444 | 12.257 |
| 0.813888888888889 | 12.257 |
| 0.8145833333333333 | 12.257 |
| 0.8152777777777778 | 12.257 |
| 0.8159722222222222 | 12.257 |
| 0.8166666666666668 | 7.887 |
| 0.8173611111111111 | 7.887 |
| 0.8180555555555555 | 7.887 |
| 0.81875 | 7.887 |
| 0.8194444444444445 | 7.887 |
| 0.8201388888888889 | 7.887 |
| 0.8208333333333333 | 7.887 |
| 0.8215277777777777 | 3.525 |
| 0.8222222222222223 | 3.525 |
| 0.8229166666666666 | 3.525 |
| 0.8236111111111111 | 3.525 |
| 0.8243055555555556 | 3.525 |
| 0.8250000000000001 | 3.525 |
| 0.8256944444444444 | 3.525 |
| 0.8263888888888888 | 3.525 |
| 0.8270833333333334 | 0 |
| 0.8277777777777778 | 3.525 |
| 0.8284722222222222 | 0 |
| 0.8291666666666666 | 0 |
| 0.8298611111111112 | 0 |
| 0.8305555555555556 | 0 |
| 0.8312499999999999 | 0 |
| 0.8319444444444444 | 0 |
| 0.8326388888888889 | 0 |
| 0.8333333333333334 | 0 |
| 0.8340277777777777 | 0 |
| 0.8347222222222223 | 0 |
| 0.8354166666666667 | 0 |
| 0.8361111111111111 | 0 |
| 0.8368055555555555 | 0 |
| 0.8375 | 0 |
| 0.8381944444444445 | 0 |
| 0.8388888888888889 | 0 |
| 0.8395833333333332 | 0 |
| 0.8402777777777778 | 0 |
| 0.8409722222222222 | 0 |
| 0.8416666666666667 | 0 |
| 0.842361111111111 | 0 |
| 0.8430555555555556 | 0 |
| 0.84375 | 0 |
| 0.8444444444444444 | 0 |
| 0.845138888888889 | 0 |
| 0.8458333333333333 | 0 |
| 0.8465277777777778 | 0 |
| 0.8472222222222222 | 0 |
| 0.8479166666666668 | 0 |
| 0.8486111111111111 | 0 |
| 0.8493055555555555 | 0 |
| 0.85 | 0 |
| 0.8506944444444445 | 0 |
| 0.8513888888888889 | 0 |
| 0.8520833333333333 | 0 |
| 0.8527777777777777 | 0 |
| 0.8534722222222223 | 0 |
| 0.8541666666666666 | 0 |
| 0.8548611111111111 | 0 |
| 0.8555555555555556 | 0 |
| 0.8562500000000001 | 0 |
| 0.8569444444444444 | 0 |
| 0.8576388888888888 | 0 |
| 0.8583333333333334 | 0 |
| 0.8590277777777778 | 0 |
| 0.8597222222222222 | 0 |
| 0.8604166666666666 | 0 |
| 0.8611111111111112 | 0 |
| 0.8618055555555556 | 0 |
| 0.8624999999999999 | 0 |
| 0.8631944444444444 | 0 |
| 0.8638888888888889 | 0 |
| 0.8645833333333334 | 0 |
| 0.8652777777777777 | 0 |
| 0.8659722222222223 | 0 |
| 0.8666666666666667 | 0 |
| 0.8673611111111111 | 0 |
| 0.8680555555555555 | 0 |
| 0.86875 | 0 |
| 0.8694444444444445 | 0 |
| 0.8701388888888889 | 0 |
| 0.8708333333333332 | 0 |
| 0.8715277777777778 | 0 |
| 0.8722222222222222 | 0 |
| 0.8729166666666667 | 0 |
| 0.873611111111111 | 0 |
| 0.8743055555555556 | 0 |
| 0.875 | 0 |
| 0.8756944444444444 | 0 |
| 0.876388888888889 | 0 |
| 0.8770833333333333 | 0 |
| 0.8777777777777778 | 0 |
| 0.8784722222222222 | 0 |
| 0.8791666666666668 | 0 |
| 0.8798611111111111 | 0 |
| 0.8805555555555555 | 0 |
| 0.88125 | 0 |
| 0.8819444444444445 | 0 |
| 0.8826388888888889 | 0 |
| 0.8833333333333333 | 0 |
| 0.8840277777777777 | 0 |
| 0.8847222222222223 | 0 |
| 0.8854166666666666 | 0 |
| 0.8861111111111111 | 0 |
| 0.8868055555555556 | 0 |
| 0.8875000000000001 | 0 |
| 0.8881944444444444 | 0 |
| 0.8888888888888888 | 0 |
| 0.8895833333333334 | 0 |
| 0.8902777777777778 | 0 |
| 0.8909722222222222 | 0 |
| 0.8916666666666666 | 0 |
| 0.8923611111111112 | 0 |
| 0.8930555555555556 | 0 |
| 0.8937499999999999 | 0 |
| 0.8944444444444444 | 0 |
| 0.8951388888888889 | 0 |
| 0.8958333333333334 | 0 |
| 0.8965277777777777 | 0 |
| 0.8972222222222223 | 0 |
| 0.8979166666666667 | 0 |
| 0.8986111111111111 | 0 |
| 0.8993055555555555 | 0 |
| 0.9 | 0 |
| 0.9006944444444445 | 0 |
| 0.9013888888888889 | 0 |
| 0.9020833333333332 | 0 |
| 0.9027777777777778 | 0 |
| 0.9034722222222222 | 0 |
| 0.9041666666666667 | 0 |
| 0.904861111111111 | 0 |
| 0.9055555555555556 | 0 |
| 0.90625 | 0 |
| 0.9069444444444444 | 0 |
| 0.907638888888889 | 0 |
| 0.9083333333333333 | 0 |
| 0.9090277777777778 | 0 |
| 0.9097222222222222 | 0 |
| 0.9104166666666668 | 0 |
| 0.9111111111111111 | 0 |
| 0.9118055555555555 | 0 |
| 0.9125 | 0 |
| 0.9131944444444445 | 0 |
| 0.9138888888888889 | 0 |
| 0.9145833333333333 | 0 |
| 0.9152777777777777 | 0 |
| 0.9159722222222223 | 0 |
| 0.9166666666666666 | 0 |
| 0.9173611111111111 | 0 |
| 0.9180555555555556 | 0 |
| 0.9187500000000001 | 0 |
| 0.9194444444444444 | 0 |
| 0.9201388888888888 | 0 |
| 0.9208333333333334 | 0 |
| 0.9215277777777778 | 0 |
| 0.9222222222222222 | 0 |
| 0.9229166666666666 | 0 |
| 0.9236111111111112 | 0 |
| 0.9243055555555556 | 0 |
| 0.9249999999999999 | 0 |
| 0.9256944444444444 | 0 |
| 0.9263888888888889 | 0 |
| 0.9270833333333334 | 0 |
| 0.9277777777777777 | 0 |
| 0.9284722222222223 | 0 |
| 0.9291666666666667 | 0 |
| 0.9298611111111111 | 0 |
| 0.9305555555555555 | 0 |
| 0.93125 | 0 |
| 0.9319444444444445 | 0 |
| 0.9326388888888889 | 0 |
| 0.9333333333333332 | 0 |
| 0.9340277777777778 | 0 |
| 0.9347222222222222 | 0 |
| 0.9354166666666667 | 0 |
| 0.936111111111111 | 0 |
| 0.9368055555555556 | 0 |
| 0.9375 | 0 |
| 0.9381944444444444 | 0 |
| 0.938888888888889 | 0 |
| 0.9395833333333333 | 0 |
| 0.9402777777777778 | 0 |
| 0.9409722222222222 | 0 |
| 0.9416666666666668 | 0 |
| 0.9423611111111111 | 0 |
| 0.9430555555555555 | 0 |
| 0.94375 | 0 |
| 0.9444444444444445 | 0 |
| 0.9451388888888889 | 0 |
| 0.9458333333333333 | 0 |
| 0.9465277777777777 | 0 |
| 0.9472222222222223 | 0 |
| 0.9479166666666666 | 0 |
| 0.9486111111111111 | 0 |
| 0.9493055555555556 | 0 |
| 0.9500000000000001 | 0 |
| 0.9506944444444444 | 0 |
| 0.9513888888888888 | 0 |
| 0.9520833333333334 | 0 |
| 0.9527777777777778 | 0 |
| 0.9534722222222222 | 0 |
| 0.9541666666666666 | 0 |
| 0.9548611111111112 | 0 |
| 0.9555555555555556 | 0 |
| 0.9562499999999999 | 0 |
| 0.9569444444444444 | 0 |
| 0.9576388888888889 | 0 |
| 0.9583333333333334 | 0 |
| 0.9590277777777777 | 0 |
| 0.9597222222222223 | 0 |
| 0.9604166666666667 | 0 |
| 0.9611111111111111 | 0 |
| 0.9618055555555555 | 0 |
| 0.9625 | 0 |
| 0.9631944444444445 | 0 |
| 0.9638888888888889 | 0 |
| 0.9645833333333332 | 0 |
| 0.9652777777777778 | 0 |
| 0.9659722222222222 | 0 |
| 0.9666666666666667 | 0 |
| 0.967361111111111 | 0 |
| 0.9680555555555556 | 0 |
| 0.96875 | 0 |
| 0.9694444444444444 | 0 |
| 0.970138888888889 | 0 |
| 0.9708333333333333 | 0 |
| 0.9715277777777778 | 0 |
| 0.9722222222222222 | 0 |
| 0.9729166666666668 | 0 |
| 0.9736111111111111 | 0 |
| 0.9743055555555555 | 0 |
| 0.975 | 0 |
| 0.9756944444444445 | 0 |
| 0.9763888888888889 | 0 |
| 0.9770833333333333 | 0 |
| 0.9777777777777777 | 0 |
| 0.9784722222222223 | 0 |
| 0.9791666666666666 | 0 |
| 0.9798611111111111 | 0 |
| 0.9805555555555556 | 0 |
| 0.9812500000000001 | 0 |
| 0.9819444444444444 | 0 |
| 0.9826388888888888 | 0 |
| 0.9833333333333334 | 0 |
| 0.9840277777777778 | 0 |
| 0.9847222222222222 | 0 |
| 0.9854166666666666 | 0 |
| 0.9861111111111112 | 0 |
| 0.9868055555555556 | 0 |
| 0.9874999999999999 | 0 |
| 0.9881944444444444 | 0 |
| 0.9888888888888889 | 0 |
| 0.9895833333333334 | 0 |
| 0.9902777777777777 | 0 |
| 0.9909722222222223 | 0 |
| 0.9916666666666667 | 0 |
| 0.9923611111111111 | 0 |
| 0.9930555555555555 | 0 |
| 0.99375 | 0 |
| 0.9944444444444445 | 0 |
| 0.9951388888888889 | 0 |
| 0.9958333333333332 | 0 |
| 0.9965277777777778 | 0 |
| 0.9972222222222222 | 0 |
| 0.9979166666666667 | 0 |
| 0.998611111111111 | 0 |
| 0.9993055555555556 | 0 |